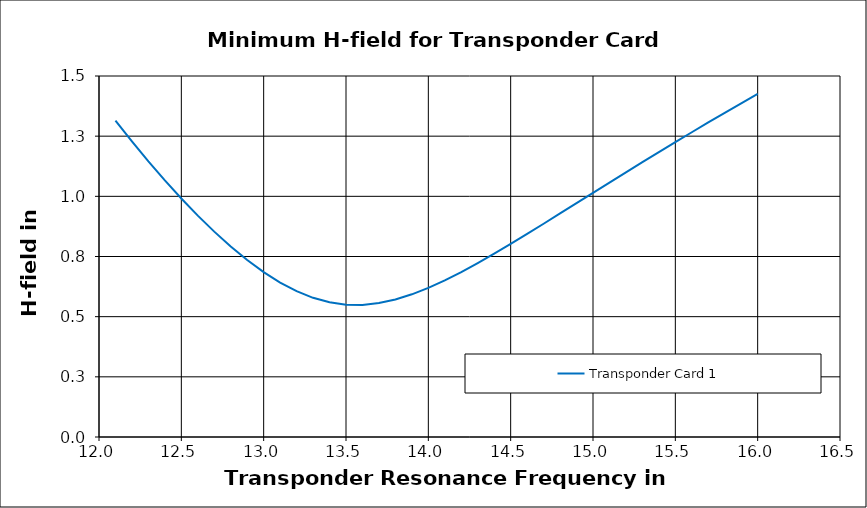
| Category | Transponder Card 1 |
|---|---|
| 12.1 | 1.315 |
| 12.2 | 1.228 |
| 12.3 | 1.145 |
| 12.4 | 1.066 |
| 12.5 | 0.991 |
| 12.6 | 0.92 |
| 12.7 | 0.853 |
| 12.8 | 0.792 |
| 12.9 | 0.735 |
| 13.0 | 0.685 |
| 13.1 | 0.642 |
| 13.2 | 0.606 |
| 13.3 | 0.578 |
| 13.4 | 0.56 |
| 13.5 | 0.55 |
| 13.6 | 0.549 |
| 13.7 | 0.556 |
| 13.8 | 0.571 |
| 13.9 | 0.593 |
| 14.0 | 0.62 |
| 14.1 | 0.651 |
| 14.2 | 0.685 |
| 14.3 | 0.723 |
| 14.4 | 0.762 |
| 14.5 | 0.802 |
| 14.6 | 0.844 |
| 14.7 | 0.886 |
| 14.8 | 0.929 |
| 14.9 | 0.972 |
| 15.0 | 1.014 |
| 15.1 | 1.057 |
| 15.2 | 1.1 |
| 15.3 | 1.142 |
| 15.4 | 1.184 |
| 15.5 | 1.225 |
| 15.6 | 1.266 |
| 15.7 | 1.307 |
| 15.8 | 1.347 |
| 15.9 | 1.386 |
| 16.0 | 1.425 |